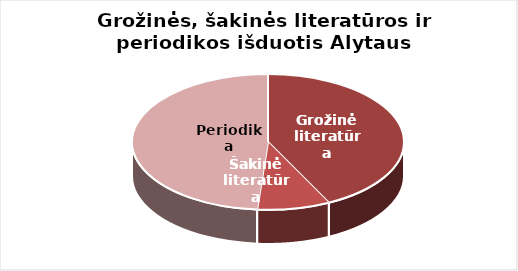
| Category | Series 0 |
|---|---|
| Grožinė literatūra | 498302 |
| Šakinė literatūra | 101067 |
| Periodika | 569799 |